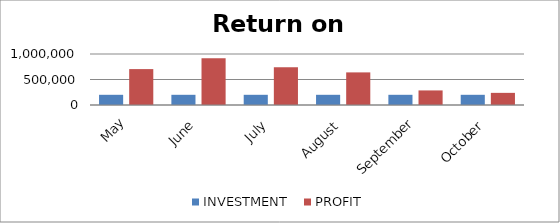
| Category | INVESTMENT  | PROFIT |
|---|---|---|
| May | 200000 | 704026 |
| June | 200000 | 916295 |
| July | 200000 | 740068 |
| August | 200000 | 639420 |
| September | 200000 | 285737 |
| October | 200000 | 238010 |